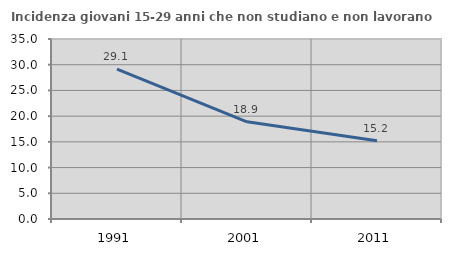
| Category | Incidenza giovani 15-29 anni che non studiano e non lavorano  |
|---|---|
| 1991.0 | 29.136 |
| 2001.0 | 18.889 |
| 2011.0 | 15.205 |